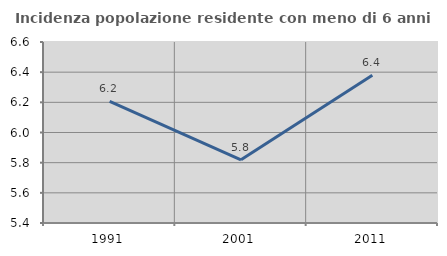
| Category | Incidenza popolazione residente con meno di 6 anni |
|---|---|
| 1991.0 | 6.207 |
| 2001.0 | 5.819 |
| 2011.0 | 6.379 |